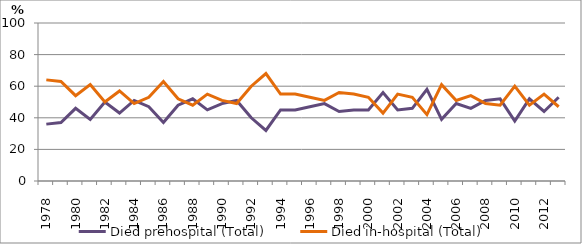
| Category | Died prehospital (Total) | Died in-hospital (Total) |
|---|---|---|
| 1978.0 | 36 | 64 |
| 1979.0 | 37 | 63 |
| 1980.0 | 46 | 54 |
| 1981.0 | 39 | 61 |
| 1982.0 | 50 | 50 |
| 1983.0 | 43 | 57 |
| 1984.0 | 51 | 49 |
| 1985.0 | 47 | 53 |
| 1986.0 | 37 | 63 |
| 1987.0 | 48 | 52 |
| 1988.0 | 52 | 48 |
| 1989.0 | 45 | 55 |
| 1990.0 | 49 | 51 |
| 1991.0 | 51 | 49 |
| 1992.0 | 40 | 60 |
| 1993.0 | 32 | 68 |
| 1994.0 | 45 | 55 |
| 1995.0 | 45 | 55 |
| 1996.0 | 47 | 53 |
| 1997.0 | 49 | 51 |
| 1998.0 | 44 | 56 |
| 1999.0 | 45 | 55 |
| 2000.0 | 45 | 53 |
| 2001.0 | 56 | 43 |
| 2002.0 | 45 | 55 |
| 2003.0 | 46 | 53 |
| 2004.0 | 58 | 42 |
| 2005.0 | 39 | 61 |
| 2006.0 | 49 | 51 |
| 2007.0 | 46 | 54 |
| 2008.0 | 51 | 49 |
| 2009.0 | 52 | 48 |
| 2010.0 | 38 | 60 |
| 2011.0 | 52 | 48 |
| 2012.0 | 44 | 55 |
| 2013.0 | 53 | 47 |